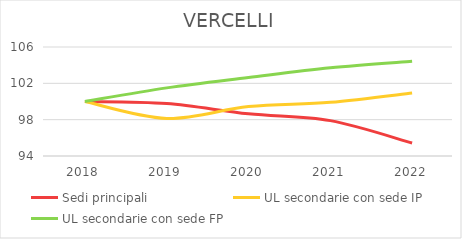
| Category | Sedi principali | UL secondarie con sede IP | UL secondarie con sede FP |
|---|---|---|---|
| 2018.0 | 100 | 100 | 100 |
| 2019.0 | 99.778 | 98.138 | 101.499 |
| 2020.0 | 98.644 | 99.441 | 102.641 |
| 2021.0 | 97.893 | 99.907 | 103.712 |
| 2022.0 | 95.428 | 100.931 | 104.425 |